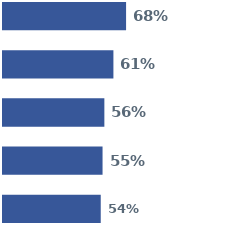
| Category | Series 0 | Series 1 | Series 2 | Series 3 | Series 4 |
|---|---|---|---|---|---|
| 0 | 0.68 | 0.61 | 0.56 | 0.55 | 0.54 |